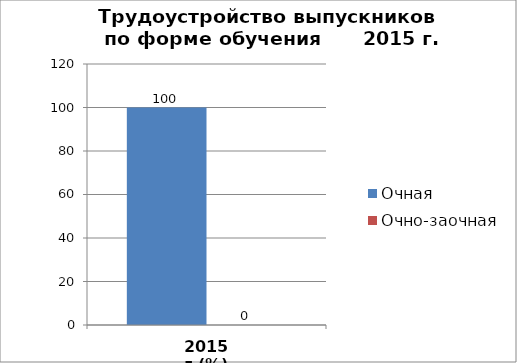
| Category | Очная | Очно-заочная |
|---|---|---|
| 2015 г.(%) | 100 | 0 |